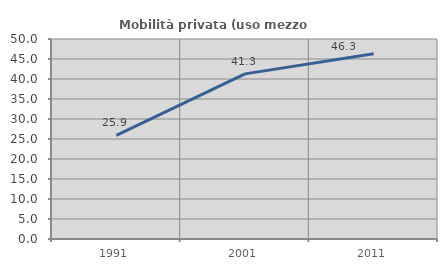
| Category | Mobilità privata (uso mezzo privato) |
|---|---|
| 1991.0 | 25.911 |
| 2001.0 | 41.286 |
| 2011.0 | 46.291 |